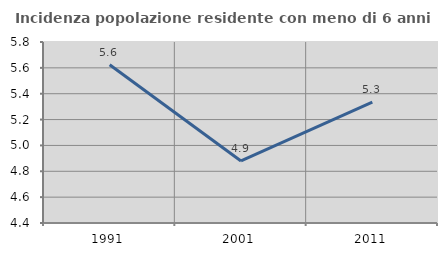
| Category | Incidenza popolazione residente con meno di 6 anni |
|---|---|
| 1991.0 | 5.623 |
| 2001.0 | 4.88 |
| 2011.0 | 5.335 |